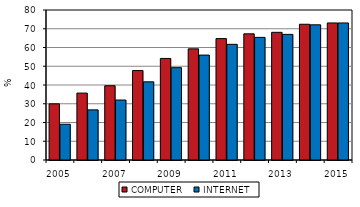
| Category | COMPUTER | INTERNET |
|---|---|---|
| 2005.0 | 29.957 | 19.079 |
| 2006.0 | 35.69 | 26.736 |
| 2007.0 | 39.612 | 31.984 |
| 2008.0 | 47.702 | 41.7 |
| 2009.0 | 54.173 | 49.246 |
| 2010.0 | 59.275 | 55.954 |
| 2011.0 | 64.75 | 61.7 |
| 2012.0 | 67.285 | 65.4 |
| 2013.0 | 68.1 | 67 |
| 2014.0 | 72.4 | 72.1 |
| 2015.0 | 73.1 | 73.1 |